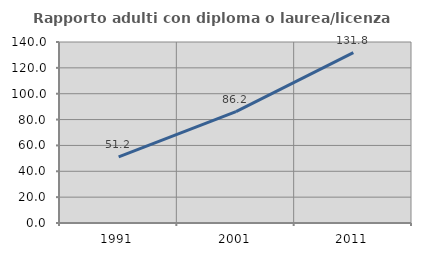
| Category | Rapporto adulti con diploma o laurea/licenza media  |
|---|---|
| 1991.0 | 51.181 |
| 2001.0 | 86.207 |
| 2011.0 | 131.799 |